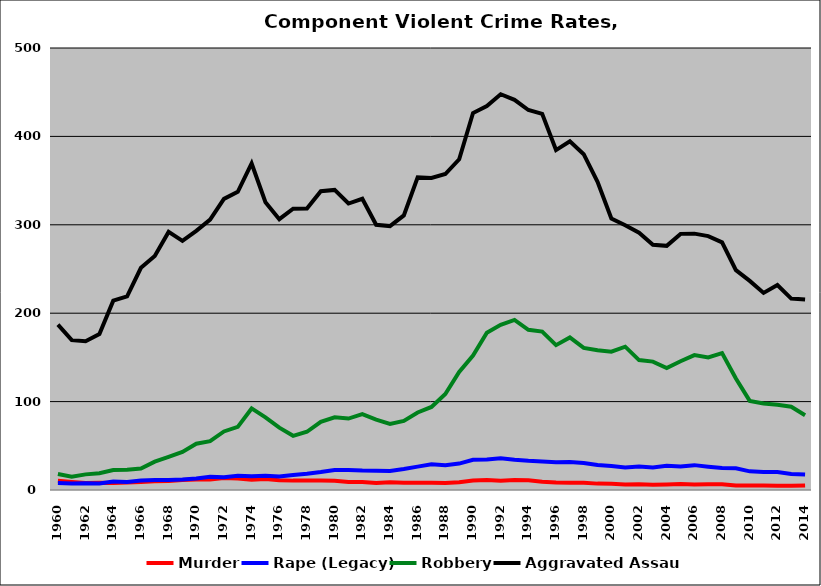
| Category | Murder | Rape (Legacy) | Robbery | Aggravated Assault |
|---|---|---|---|---|
| 1960.0 | 10.579 | 7.792 | 18.107 | 187 |
| 1961.0 | 9.189 | 7.282 | 15.041 | 169.506 |
| 1962.0 | 7.884 | 7.652 | 17.671 | 168.294 |
| 1963.0 | 8.214 | 7.269 | 18.971 | 176.429 |
| 1964.0 | 8.038 | 9.563 | 22.65 | 214.18 |
| 1965.0 | 8.344 | 9.137 | 22.975 | 219.109 |
| 1966.0 | 9.18 | 10.76 | 24.26 | 251.3 |
| 1967.0 | 9.903 | 11.275 | 32.094 | 264.784 |
| 1968.0 | 10.243 | 11.276 | 37.566 | 291.938 |
| 1969.0 | 11.297 | 11.892 | 43.112 | 281.768 |
| 1970.0 | 11.747 | 12.948 | 52.341 | 293.169 |
| 1971.0 | 11.776 | 14.846 | 55.266 | 305.83 |
| 1972.0 | 13.502 | 14.557 | 66.206 | 329.344 |
| 1973.0 | 12.953 | 16.063 | 71.42 | 337.379 |
| 1974.0 | 11.729 | 15.532 | 92.262 | 369.383 |
| 1975.0 | 12.42 | 16.236 | 82.168 | 325.628 |
| 1976.0 | 11.135 | 15.323 | 70.561 | 306.363 |
| 1977.0 | 10.606 | 16.959 | 61.267 | 318.262 |
| 1978.0 | 10.758 | 18.361 | 65.86 | 318.397 |
| 1979.0 | 10.703 | 20.282 | 77.185 | 337.941 |
| 1980.0 | 10.593 | 22.657 | 82.311 | 339.445 |
| 1981.0 | 9.091 | 22.702 | 80.81 | 324.063 |
| 1982.0 | 9.055 | 21.964 | 85.861 | 329.457 |
| 1983.0 | 8.057 | 21.901 | 79.579 | 300.049 |
| 1984.0 | 8.743 | 21.573 | 74.809 | 298.524 |
| 1985.0 | 8.313 | 23.789 | 78.225 | 310.568 |
| 1986.0 | 8.135 | 26.426 | 87.68 | 353.641 |
| 1987.0 | 8.093 | 29.05 | 93.919 | 352.939 |
| 1988.0 | 7.815 | 28.088 | 108.566 | 357.416 |
| 1989.0 | 8.888 | 29.889 | 133.465 | 374.129 |
| 1990.0 | 10.726 | 34.276 | 152.098 | 426.438 |
| 1991.0 | 11.415 | 34.6 | 177.972 | 434.392 |
| 1992.0 | 10.566 | 35.876 | 186.819 | 447.728 |
| 1993.0 | 11.303 | 34.255 | 192.426 | 441.325 |
| 1994.0 | 10.919 | 33.013 | 181.202 | 429.859 |
| 1995.0 | 9.409 | 32.245 | 179.236 | 425.504 |
| 1996.0 | 8.453 | 31.258 | 163.881 | 384.528 |
| 1997.0 | 8.269 | 31.623 | 172.62 | 394.505 |
| 1998.0 | 8.11 | 30.625 | 160.787 | 379.897 |
| 1999.0 | 7.215 | 28.167 | 157.984 | 348.722 |
| 2000.0 | 6.957 | 27.095 | 156.473 | 307.045 |
| 2001.0 | 6.154 | 25.384 | 162.123 | 299.448 |
| 2002.0 | 6.598 | 26.439 | 146.945 | 290.989 |
| 2003.0 | 6.009 | 25.4 | 145.217 | 277.502 |
| 2004.0 | 6.229 | 27.387 | 137.955 | 276.226 |
| 2005.0 | 6.745 | 26.544 | 145.691 | 289.745 |
| 2006.0 | 6.097 | 28.126 | 152.611 | 290.002 |
| 2007.0 | 6.467 | 26.41 | 150.049 | 287.186 |
| 2008.0 | 6.543 | 24.764 | 154.87 | 280.13 |
| 2009.0 | 5.213 | 24.582 | 126.054 | 248.655 |
| 2010.0 | 4.992 | 21.111 | 100.781 | 236.527 |
| 2011.0 | 5.16 | 20.298 | 97.896 | 222.938 |
| 2012.0 | 4.914 | 20.352 | 96.344 | 231.926 |
| 2013.0 | 4.701 | 18.175 | 94.173 | 216.521 |
| 2014.0 | 5.129 | 17.498 | 84.634 | 215.417 |